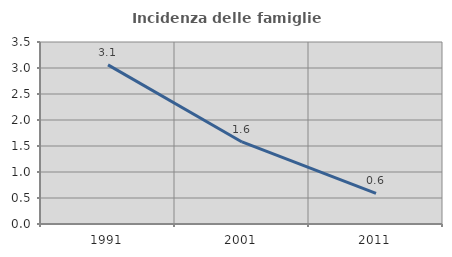
| Category | Incidenza delle famiglie numerose |
|---|---|
| 1991.0 | 3.06 |
| 2001.0 | 1.578 |
| 2011.0 | 0.589 |